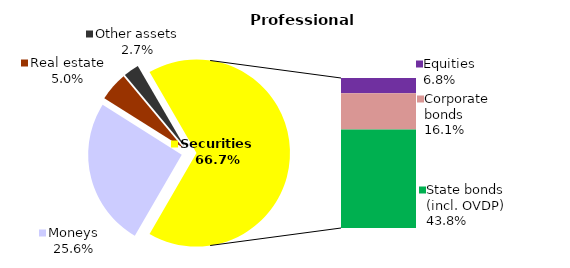
| Category | Professional |
|---|---|
| Moneys | 36.182 |
| Bank metals | 0 |
| Real estate | 7.062 |
| Other assets | 3.786 |
| Equities | 9.659 |
| Corporate bonds | 22.748 |
| Municipal bonds | 0 |
| State bonds (incl. OVDP) | 61.919 |